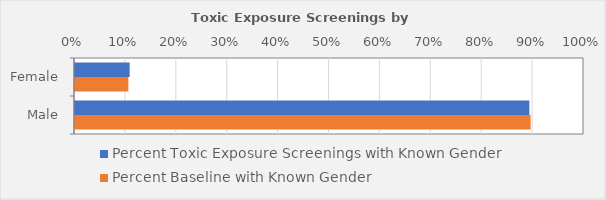
| Category | Percent Toxic Exposure Screenings with Known Gender | Percent Baseline with Known Gender |
|---|---|---|
| Female | 0.107 | 0.105 |
| Male | 0.893 | 0.895 |